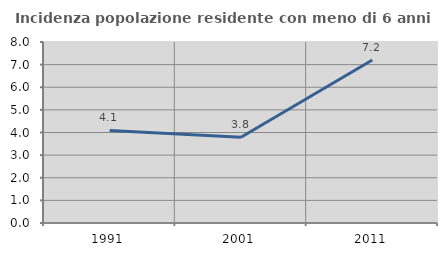
| Category | Incidenza popolazione residente con meno di 6 anni |
|---|---|
| 1991.0 | 4.09 |
| 2001.0 | 3.791 |
| 2011.0 | 7.206 |